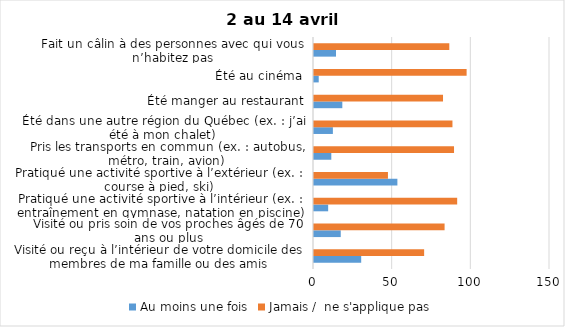
| Category | Au moins une fois | Jamais /  ne s'applique pas |
|---|---|---|
| Visité ou reçu à l’intérieur de votre domicile des membres de ma famille ou des amis | 30 | 70 |
| Visité ou pris soin de vos proches âgés de 70 ans ou plus | 17 | 83 |
| Pratiqué une activité sportive à l’intérieur (ex. : entraînement en gymnase, natation en piscine) | 9 | 91 |
| Pratiqué une activité sportive à l’extérieur (ex. : course à pied, ski) | 53 | 47 |
| Pris les transports en commun (ex. : autobus, métro, train, avion) | 11 | 89 |
| Été dans une autre région du Québec (ex. : j’ai été à mon chalet) | 12 | 88 |
| Été manger au restaurant | 18 | 82 |
| Été au cinéma | 3 | 97 |
| Fait un câlin à des personnes avec qui vous n’habitez pas | 14 | 86 |